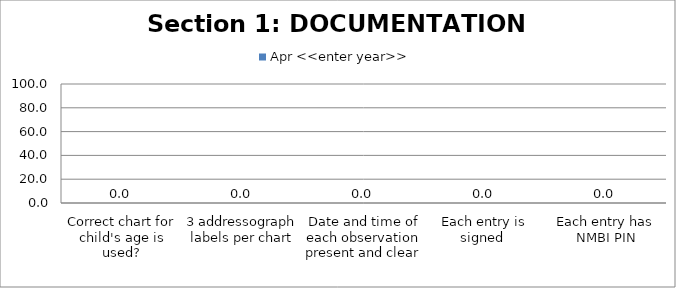
| Category | Apr <<enter year>> |
|---|---|
| Correct chart for child's age is used? | 0 |
| 3 addressograph labels per chart | 0 |
| Date and time of each observation present and clear  | 0 |
| Each entry is signed  | 0 |
| Each entry has NMBI PIN | 0 |